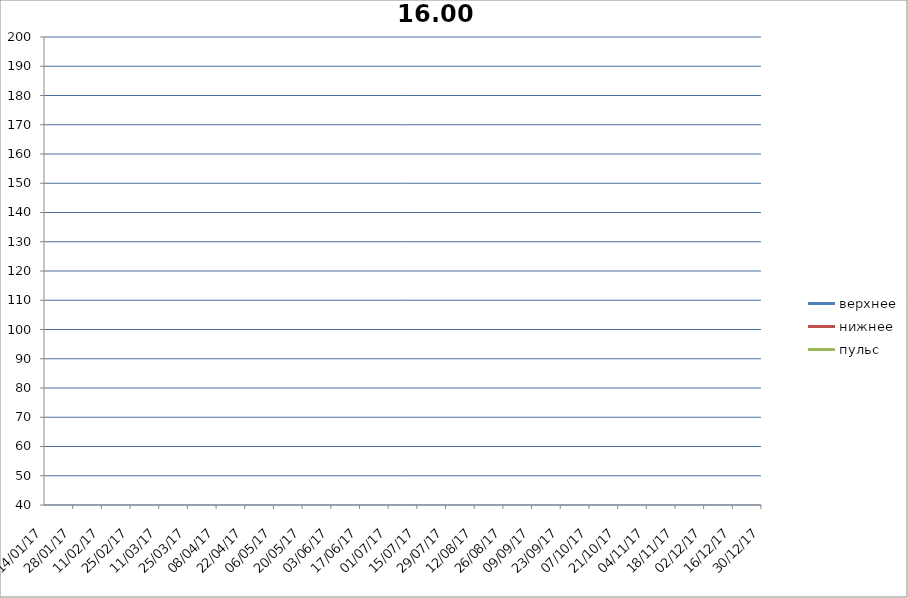
| Category | верхнее | нижнее | пульс |
|---|---|---|---|
| 2017-01-14 | 0 | 0 | 0 |
| 2017-01-28 | 0 | 0 | 0 |
| 2017-02-11 | 0 | 0 | 0 |
| 2017-02-25 | 0 | 0 | 0 |
| 2017-03-11 | 0 | 0 | 0 |
| 2017-03-25 | 0 | 0 | 0 |
| 2017-04-08 | 0 | 0 | 0 |
| 2017-04-22 | 0 | 0 | 0 |
| 2017-05-06 | 0 | 0 | 0 |
| 2017-05-20 | 0 | 0 | 0 |
| 2017-06-03 | 0 | 0 | 0 |
| 2017-06-17 | 0 | 0 | 0 |
| 2017-07-01 | 0 | 0 | 0 |
| 2017-07-15 | 0 | 0 | 0 |
| 2017-07-29 | 0 | 0 | 0 |
| 2017-08-12 | 0 | 0 | 0 |
| 2017-08-26 | 0 | 0 | 0 |
| 2017-09-09 | 0 | 0 | 0 |
| 2017-09-23 | 0 | 0 | 0 |
| 2017-10-07 | 0 | 0 | 0 |
| 2017-10-21 | 0 | 0 | 0 |
| 2017-11-04 | 0 | 0 | 0 |
| 2017-11-18 | 0 | 0 | 0 |
| 2017-12-02 | 0 | 0 | 0 |
| 2017-12-16 | 0 | 0 | 0 |
| 2017-12-30 | 0 | 0 | 0 |